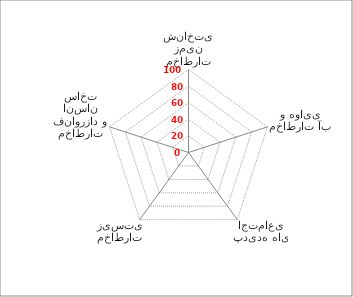
| Category | Series 0 |
|---|---|
| مخاطرات زمین شناختی | 0 |
| مخاطرات آب و هوایی | 0 |
| پدیده های اجتماعی | 0 |
| مخاطرات زیستی | 0 |
| مخاطرات فناورزاد و انسان ساخت | 0 |